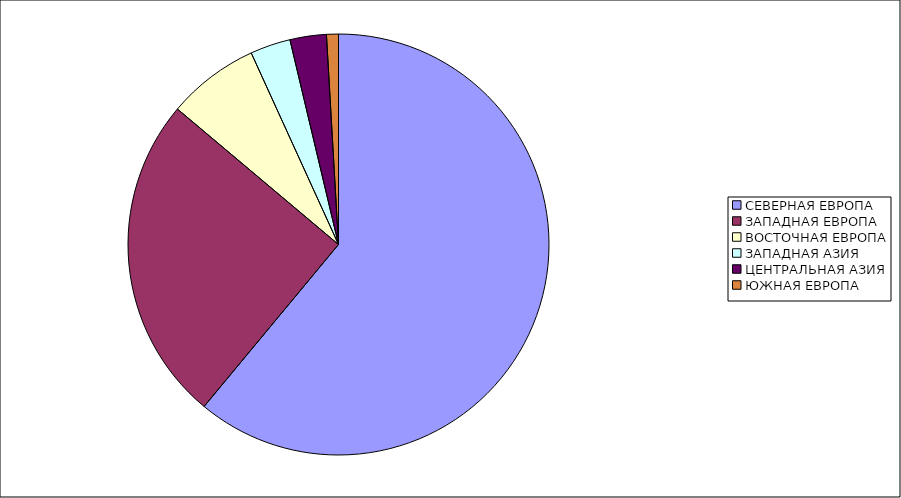
| Category | Оборот |
|---|---|
| СЕВЕРНАЯ ЕВРОПА | 61.023 |
| ЗАПАДНАЯ ЕВРОПА | 25.106 |
| ВОСТОЧНАЯ ЕВРОПА | 7.067 |
| ЗАПАДНАЯ АЗИЯ | 3.095 |
| ЦЕНТРАЛЬНАЯ АЗИЯ | 2.795 |
| ЮЖНАЯ ЕВРОПА | 0.913 |